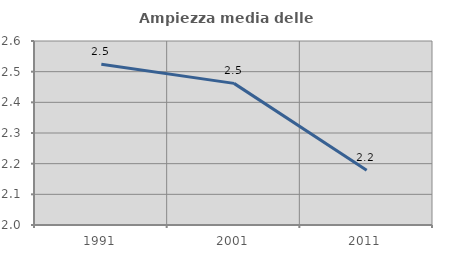
| Category | Ampiezza media delle famiglie |
|---|---|
| 1991.0 | 2.524 |
| 2001.0 | 2.462 |
| 2011.0 | 2.179 |